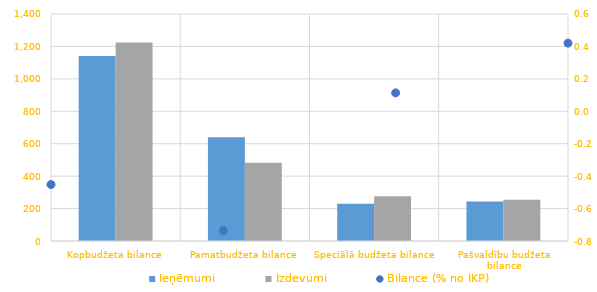
| Category | Ieņēmumi | Izdevumi |
|---|---|---|
| Kopbudžeta bilance | 1141583.555 | 1224137.323 |
| Pamatbudžeta bilance | 639232.675 | 483183.032 |
| Speciālā budžeta bilance | 229777.32 | 276006.043 |
| Pašvaldību budžeta bilance | 242842.454 | 253995.943 |